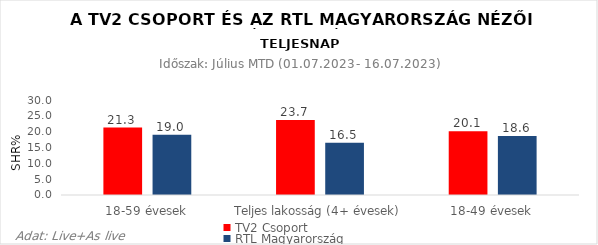
| Category | TV2 Csoport | RTL Magyarország |
|---|---|---|
| 18-59 évesek | 21.3 | 19 |
| Teljes lakosság (4+ évesek) | 23.7 | 16.5 |
| 18-49 évesek | 20.1 | 18.6 |